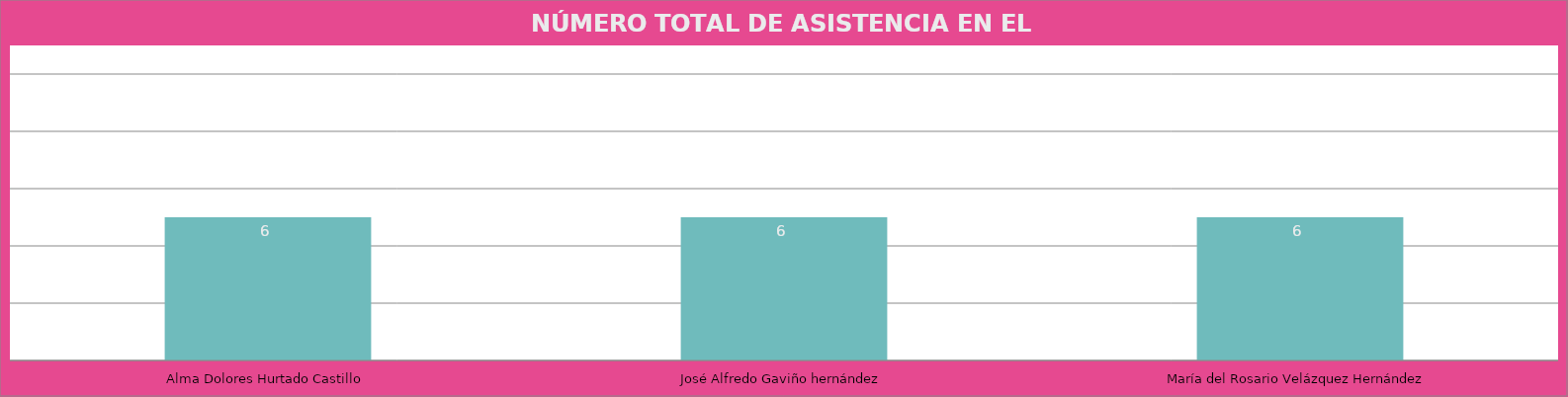
| Category | Alma Dolores Hurtado Castillo |
|---|---|
| Alma Dolores Hurtado Castillo | 6 |
| José Alfredo Gaviño hernández | 6 |
| María del Rosario Velázquez Hernández | 6 |